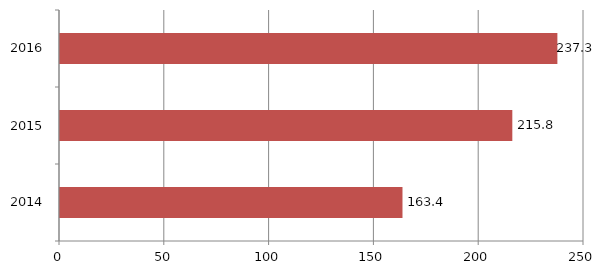
| Category | Series 0 |
|---|---|
| 2014.0 | 163.4 |
| 2015.0 | 215.8 |
| 2016.0 | 237.3 |